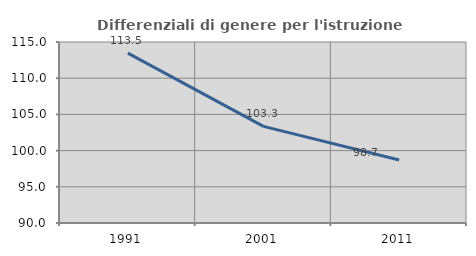
| Category | Differenziali di genere per l'istruzione superiore |
|---|---|
| 1991.0 | 113.455 |
| 2001.0 | 103.343 |
| 2011.0 | 98.706 |